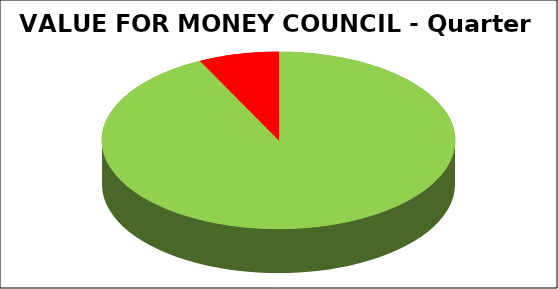
| Category | Series 0 |
|---|---|
| Green | 0.927 |
| Amber | 0 |
| Red | 0.073 |